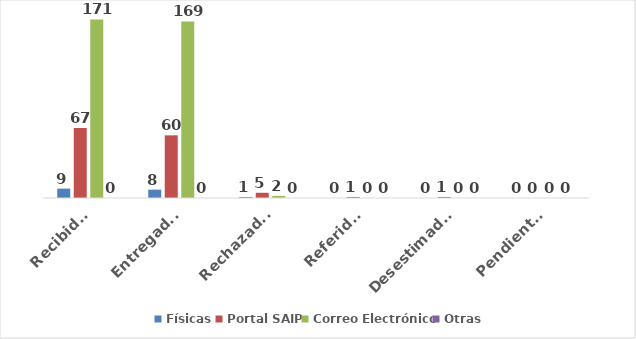
| Category | Físicas | Portal SAIP | Correo Electrónico | Otras |
|---|---|---|---|---|
| Recibidas | 9 | 67 | 171 | 0 |
| Entregadas | 8 | 60 | 169 | 0 |
| Rechazadas | 1 | 5 | 2 | 0 |
| Referidas | 0 | 1 | 0 | 0 |
| Desestimadas | 0 | 1 | 0 | 0 |
| Pendientes | 0 | 0 | 0 | 0 |